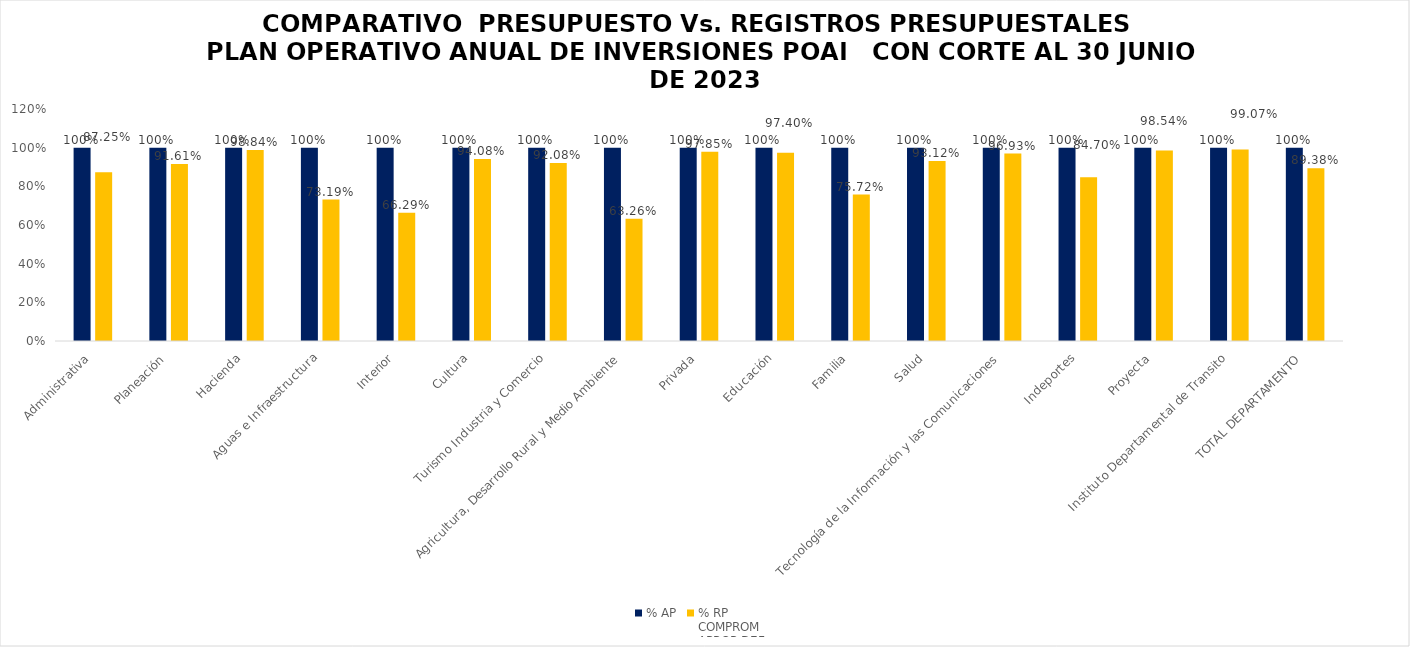
| Category | % AP | % RP
COMPROM
APROP DEF |
|---|---|---|
| Administrativa | 1 | 0.872 |
| Planeación | 1 | 0.916 |
| Hacienda | 1 | 0.988 |
| Aguas e Infraestructura | 1 | 0.732 |
| Interior | 1 | 0.663 |
| Cultura | 1 | 0.941 |
| Turismo Industria y Comercio | 1 | 0.921 |
| Agricultura, Desarrollo Rural y Medio Ambiente | 1 | 0.633 |
| Privada | 1 | 0.979 |
| Educación | 1 | 0.974 |
| Familia | 1 | 0.757 |
| Salud | 1 | 0.931 |
| Tecnología de la Información y las Comunicaciones | 1 | 0.969 |
| Indeportes | 1 | 0.847 |
| Proyecta | 1 | 0.985 |
| Instituto Departamental de Transito | 1 | 0.991 |
| TOTAL DEPARTAMENTO | 1 | 0.894 |